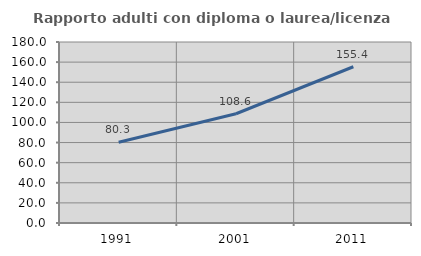
| Category | Rapporto adulti con diploma o laurea/licenza media  |
|---|---|
| 1991.0 | 80.257 |
| 2001.0 | 108.636 |
| 2011.0 | 155.382 |